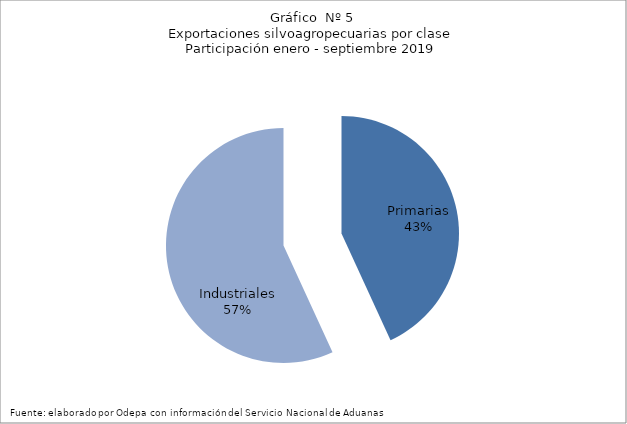
| Category | Series 0 |
|---|---|
| Primarias | 5679838 |
| Industriales | 7483633 |